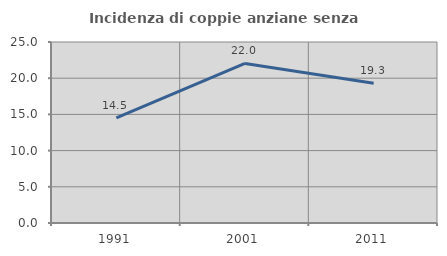
| Category | Incidenza di coppie anziane senza figli  |
|---|---|
| 1991.0 | 14.531 |
| 2001.0 | 22.043 |
| 2011.0 | 19.308 |